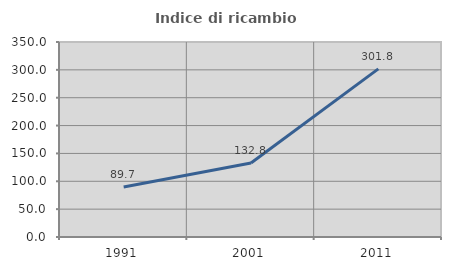
| Category | Indice di ricambio occupazionale  |
|---|---|
| 1991.0 | 89.716 |
| 2001.0 | 132.756 |
| 2011.0 | 301.783 |